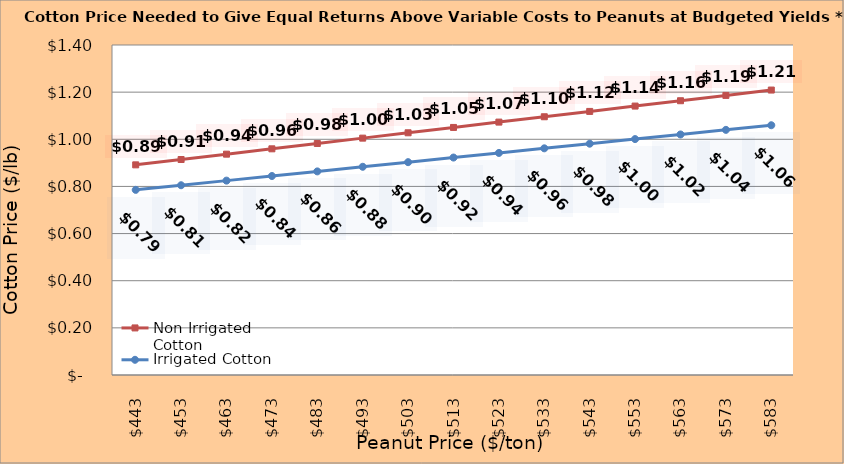
| Category | Non Irrigated Cotton | Irrigated Cotton |
|---|---|---|
| 442.5 | 0.892 | 0.785 |
| 452.5 | 0.914 | 0.805 |
| 462.5 | 0.937 | 0.825 |
| 472.5 | 0.96 | 0.844 |
| 482.5 | 0.982 | 0.864 |
| 492.5 | 1.005 | 0.883 |
| 502.5 | 1.028 | 0.903 |
| 512.5 | 1.05 | 0.923 |
| 522.5 | 1.073 | 0.942 |
| 532.5 | 1.096 | 0.962 |
| 542.5 | 1.118 | 0.981 |
| 552.5 | 1.141 | 1.001 |
| 562.5 | 1.164 | 1.02 |
| 572.5 | 1.186 | 1.04 |
| 582.5 | 1.209 | 1.06 |